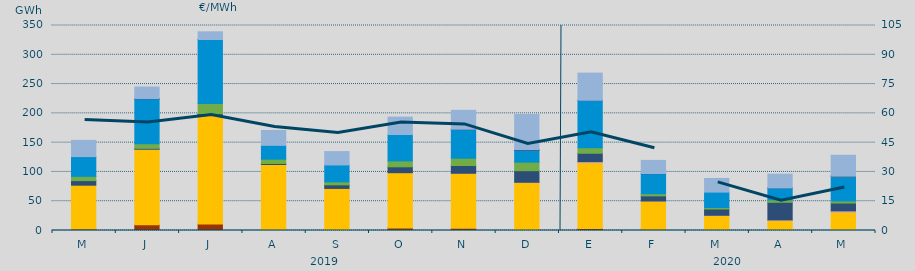
| Category | Carbón | Ciclo Combinado | Cogeneración | Consumo Bombeo | Eólica | Hidráulica | Nuclear | Otras Renovables | Solar fotovoltaica | Turbinación bombeo |
|---|---|---|---|---|---|---|---|---|---|---|
| M | 2747.5 | 74607.7 | 0 | 7818.6 | 7248.2 | 33753.6 | 0 | 0 | 0 | 27655 |
| J | 9630 | 128693.8 | 467.1 | 1487.8 | 7835.7 | 76799.4 | 366 | 20 | 0 | 19680.5 |
| J | 11017.4 | 186524.2 | 300.4 | 1392.5 | 17639.5 | 109155.5 | 60 | 0 | 0 | 13153.1 |
| A | 1459.4 | 111215 | 0 | 1733.4 | 7402.2 | 23588.2 | 0 | 0 | 0 | 25429.5 |
| S | 311.6 | 71523.4 | 0 | 6112.7 | 5081.7 | 28895.9 | 0 | 0 | 0 | 22840.2 |
| O | 4163.7 | 94511.7 | 0 | 10093.2 | 10069.8 | 45049.8 | 0 | 0 | 0 | 29699 |
| N | 3677.8 | 93991.4 | 51.5 | 13298.4 | 12383 | 48971.8 | 539 | 0 | 0 | 32260 |
| D | 1607.3 | 80390.7 | 371.4 | 19733.1 | 14568.3 | 20541.3 | 876.4 | 0 | 1.2 | 60128.2 |
| E | 3376.2 | 112471.6 | 1718.3 | 14293.3 | 9539.1 | 80742.1 | 186 | 0 | 0 | 46371.3 |
| F | 1995 | 48257.3 | 169 | 8732.4 | 3606.8 | 34283.3 | 267 | 0 | 0 | 22347.8 |
| M | 418.1 | 25069.8 | 511.6 | 10680.8 | 2598.7 | 26299.3 | 0 | 0 | 0 | 23301.1 |
| A | 0 | 17020 | 1099 | 30032 | 4029 | 20482 | 12 | 0 | 0 | 23437 |
| M | 5 | 31454.1 | 2074.9 | 13342 | 3540.5 | 42478.4 | 139 | 0 | 1 | 35473.1 |